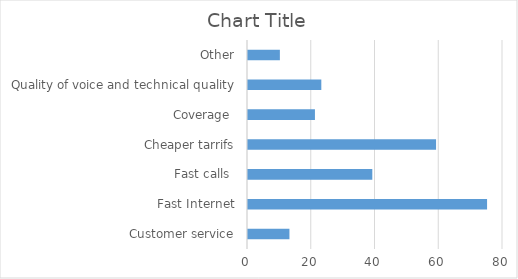
| Category | Series 0 |
|---|---|
| Customer service | 13 |
| Fast Internet | 75 |
| Fast calls  | 39 |
| Cheaper tarrifs | 59 |
| Coverage  | 21 |
| Quality of voice and technical quality | 23 |
| Other | 10 |